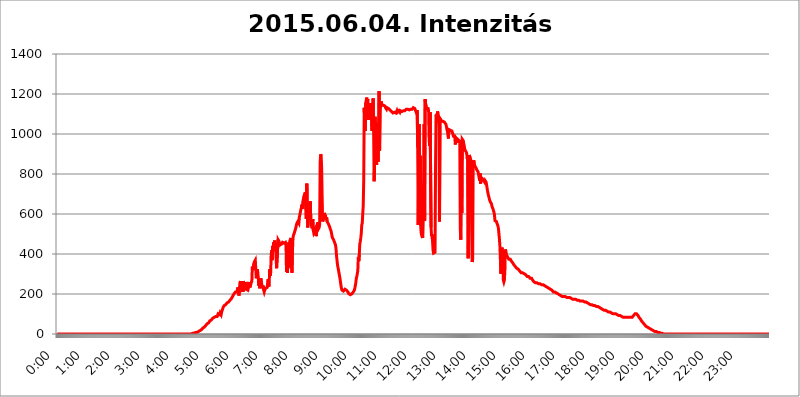
| Category | 2015.06.04. Intenzitás [W/m^2] |
|---|---|
| 0.0 | 0 |
| 0.0006944444444444445 | 0 |
| 0.001388888888888889 | 0 |
| 0.0020833333333333333 | 0 |
| 0.002777777777777778 | 0 |
| 0.003472222222222222 | 0 |
| 0.004166666666666667 | 0 |
| 0.004861111111111111 | 0 |
| 0.005555555555555556 | 0 |
| 0.0062499999999999995 | 0 |
| 0.006944444444444444 | 0 |
| 0.007638888888888889 | 0 |
| 0.008333333333333333 | 0 |
| 0.009027777777777779 | 0 |
| 0.009722222222222222 | 0 |
| 0.010416666666666666 | 0 |
| 0.011111111111111112 | 0 |
| 0.011805555555555555 | 0 |
| 0.012499999999999999 | 0 |
| 0.013194444444444444 | 0 |
| 0.013888888888888888 | 0 |
| 0.014583333333333332 | 0 |
| 0.015277777777777777 | 0 |
| 0.015972222222222224 | 0 |
| 0.016666666666666666 | 0 |
| 0.017361111111111112 | 0 |
| 0.018055555555555557 | 0 |
| 0.01875 | 0 |
| 0.019444444444444445 | 0 |
| 0.02013888888888889 | 0 |
| 0.020833333333333332 | 0 |
| 0.02152777777777778 | 0 |
| 0.022222222222222223 | 0 |
| 0.02291666666666667 | 0 |
| 0.02361111111111111 | 0 |
| 0.024305555555555556 | 0 |
| 0.024999999999999998 | 0 |
| 0.025694444444444447 | 0 |
| 0.02638888888888889 | 0 |
| 0.027083333333333334 | 0 |
| 0.027777777777777776 | 0 |
| 0.02847222222222222 | 0 |
| 0.029166666666666664 | 0 |
| 0.029861111111111113 | 0 |
| 0.030555555555555555 | 0 |
| 0.03125 | 0 |
| 0.03194444444444445 | 0 |
| 0.03263888888888889 | 0 |
| 0.03333333333333333 | 0 |
| 0.034027777777777775 | 0 |
| 0.034722222222222224 | 0 |
| 0.035416666666666666 | 0 |
| 0.036111111111111115 | 0 |
| 0.03680555555555556 | 0 |
| 0.0375 | 0 |
| 0.03819444444444444 | 0 |
| 0.03888888888888889 | 0 |
| 0.03958333333333333 | 0 |
| 0.04027777777777778 | 0 |
| 0.04097222222222222 | 0 |
| 0.041666666666666664 | 0 |
| 0.042361111111111106 | 0 |
| 0.04305555555555556 | 0 |
| 0.043750000000000004 | 0 |
| 0.044444444444444446 | 0 |
| 0.04513888888888889 | 0 |
| 0.04583333333333334 | 0 |
| 0.04652777777777778 | 0 |
| 0.04722222222222222 | 0 |
| 0.04791666666666666 | 0 |
| 0.04861111111111111 | 0 |
| 0.049305555555555554 | 0 |
| 0.049999999999999996 | 0 |
| 0.05069444444444445 | 0 |
| 0.051388888888888894 | 0 |
| 0.052083333333333336 | 0 |
| 0.05277777777777778 | 0 |
| 0.05347222222222222 | 0 |
| 0.05416666666666667 | 0 |
| 0.05486111111111111 | 0 |
| 0.05555555555555555 | 0 |
| 0.05625 | 0 |
| 0.05694444444444444 | 0 |
| 0.057638888888888885 | 0 |
| 0.05833333333333333 | 0 |
| 0.05902777777777778 | 0 |
| 0.059722222222222225 | 0 |
| 0.06041666666666667 | 0 |
| 0.061111111111111116 | 0 |
| 0.06180555555555556 | 0 |
| 0.0625 | 0 |
| 0.06319444444444444 | 0 |
| 0.06388888888888888 | 0 |
| 0.06458333333333334 | 0 |
| 0.06527777777777778 | 0 |
| 0.06597222222222222 | 0 |
| 0.06666666666666667 | 0 |
| 0.06736111111111111 | 0 |
| 0.06805555555555555 | 0 |
| 0.06874999999999999 | 0 |
| 0.06944444444444443 | 0 |
| 0.07013888888888889 | 0 |
| 0.07083333333333333 | 0 |
| 0.07152777777777779 | 0 |
| 0.07222222222222223 | 0 |
| 0.07291666666666667 | 0 |
| 0.07361111111111111 | 0 |
| 0.07430555555555556 | 0 |
| 0.075 | 0 |
| 0.07569444444444444 | 0 |
| 0.0763888888888889 | 0 |
| 0.07708333333333334 | 0 |
| 0.07777777777777778 | 0 |
| 0.07847222222222222 | 0 |
| 0.07916666666666666 | 0 |
| 0.0798611111111111 | 0 |
| 0.08055555555555556 | 0 |
| 0.08125 | 0 |
| 0.08194444444444444 | 0 |
| 0.08263888888888889 | 0 |
| 0.08333333333333333 | 0 |
| 0.08402777777777777 | 0 |
| 0.08472222222222221 | 0 |
| 0.08541666666666665 | 0 |
| 0.08611111111111112 | 0 |
| 0.08680555555555557 | 0 |
| 0.08750000000000001 | 0 |
| 0.08819444444444445 | 0 |
| 0.08888888888888889 | 0 |
| 0.08958333333333333 | 0 |
| 0.09027777777777778 | 0 |
| 0.09097222222222222 | 0 |
| 0.09166666666666667 | 0 |
| 0.09236111111111112 | 0 |
| 0.09305555555555556 | 0 |
| 0.09375 | 0 |
| 0.09444444444444444 | 0 |
| 0.09513888888888888 | 0 |
| 0.09583333333333333 | 0 |
| 0.09652777777777777 | 0 |
| 0.09722222222222222 | 0 |
| 0.09791666666666667 | 0 |
| 0.09861111111111111 | 0 |
| 0.09930555555555555 | 0 |
| 0.09999999999999999 | 0 |
| 0.10069444444444443 | 0 |
| 0.1013888888888889 | 0 |
| 0.10208333333333335 | 0 |
| 0.10277777777777779 | 0 |
| 0.10347222222222223 | 0 |
| 0.10416666666666667 | 0 |
| 0.10486111111111111 | 0 |
| 0.10555555555555556 | 0 |
| 0.10625 | 0 |
| 0.10694444444444444 | 0 |
| 0.1076388888888889 | 0 |
| 0.10833333333333334 | 0 |
| 0.10902777777777778 | 0 |
| 0.10972222222222222 | 0 |
| 0.1111111111111111 | 0 |
| 0.11180555555555556 | 0 |
| 0.11180555555555556 | 0 |
| 0.1125 | 0 |
| 0.11319444444444444 | 0 |
| 0.11388888888888889 | 0 |
| 0.11458333333333333 | 0 |
| 0.11527777777777777 | 0 |
| 0.11597222222222221 | 0 |
| 0.11666666666666665 | 0 |
| 0.1173611111111111 | 0 |
| 0.11805555555555557 | 0 |
| 0.11944444444444445 | 0 |
| 0.12013888888888889 | 0 |
| 0.12083333333333333 | 0 |
| 0.12152777777777778 | 0 |
| 0.12222222222222223 | 0 |
| 0.12291666666666667 | 0 |
| 0.12291666666666667 | 0 |
| 0.12361111111111112 | 0 |
| 0.12430555555555556 | 0 |
| 0.125 | 0 |
| 0.12569444444444444 | 0 |
| 0.12638888888888888 | 0 |
| 0.12708333333333333 | 0 |
| 0.16875 | 0 |
| 0.12847222222222224 | 0 |
| 0.12916666666666668 | 0 |
| 0.12986111111111112 | 0 |
| 0.13055555555555556 | 0 |
| 0.13125 | 0 |
| 0.13194444444444445 | 0 |
| 0.1326388888888889 | 0 |
| 0.13333333333333333 | 0 |
| 0.13402777777777777 | 0 |
| 0.13402777777777777 | 0 |
| 0.13472222222222222 | 0 |
| 0.13541666666666666 | 0 |
| 0.1361111111111111 | 0 |
| 0.13749999999999998 | 0 |
| 0.13819444444444443 | 0 |
| 0.1388888888888889 | 0 |
| 0.13958333333333334 | 0 |
| 0.14027777777777778 | 0 |
| 0.14097222222222222 | 0 |
| 0.14166666666666666 | 0 |
| 0.1423611111111111 | 0 |
| 0.14305555555555557 | 0 |
| 0.14375000000000002 | 0 |
| 0.14444444444444446 | 0 |
| 0.1451388888888889 | 0 |
| 0.1451388888888889 | 0 |
| 0.14652777777777778 | 0 |
| 0.14722222222222223 | 0 |
| 0.14791666666666667 | 0 |
| 0.1486111111111111 | 0 |
| 0.14930555555555555 | 0 |
| 0.15 | 0 |
| 0.15069444444444444 | 0 |
| 0.15138888888888888 | 0 |
| 0.15208333333333332 | 0 |
| 0.15277777777777776 | 0 |
| 0.15347222222222223 | 0 |
| 0.15416666666666667 | 0 |
| 0.15486111111111112 | 0 |
| 0.15555555555555556 | 0 |
| 0.15625 | 0 |
| 0.15694444444444444 | 0 |
| 0.15763888888888888 | 0 |
| 0.15833333333333333 | 0 |
| 0.15902777777777777 | 0 |
| 0.15972222222222224 | 0 |
| 0.16041666666666668 | 0 |
| 0.16111111111111112 | 0 |
| 0.16180555555555556 | 0 |
| 0.1625 | 0 |
| 0.16319444444444445 | 0 |
| 0.1638888888888889 | 0 |
| 0.16458333333333333 | 0 |
| 0.16527777777777777 | 0 |
| 0.16597222222222222 | 0 |
| 0.16666666666666666 | 0 |
| 0.1673611111111111 | 0 |
| 0.16805555555555554 | 0 |
| 0.16874999999999998 | 0 |
| 0.16944444444444443 | 0 |
| 0.17013888888888887 | 0 |
| 0.1708333333333333 | 0 |
| 0.17152777777777775 | 0 |
| 0.17222222222222225 | 0 |
| 0.1729166666666667 | 0 |
| 0.17361111111111113 | 0 |
| 0.17430555555555557 | 0 |
| 0.17500000000000002 | 0 |
| 0.17569444444444446 | 0 |
| 0.1763888888888889 | 0 |
| 0.17708333333333334 | 0 |
| 0.17777777777777778 | 0 |
| 0.17847222222222223 | 0 |
| 0.17916666666666667 | 0 |
| 0.1798611111111111 | 0 |
| 0.18055555555555555 | 0 |
| 0.18125 | 0 |
| 0.18194444444444444 | 0 |
| 0.1826388888888889 | 0 |
| 0.18333333333333335 | 0 |
| 0.1840277777777778 | 0 |
| 0.18472222222222223 | 0 |
| 0.18541666666666667 | 0 |
| 0.18611111111111112 | 0 |
| 0.18680555555555556 | 0 |
| 0.1875 | 0 |
| 0.18819444444444444 | 0 |
| 0.18888888888888888 | 3.525 |
| 0.18958333333333333 | 3.525 |
| 0.19027777777777777 | 3.525 |
| 0.1909722222222222 | 3.525 |
| 0.19166666666666665 | 3.525 |
| 0.19236111111111112 | 3.525 |
| 0.19305555555555554 | 3.525 |
| 0.19375 | 7.887 |
| 0.19444444444444445 | 7.887 |
| 0.1951388888888889 | 7.887 |
| 0.19583333333333333 | 7.887 |
| 0.19652777777777777 | 12.257 |
| 0.19722222222222222 | 12.257 |
| 0.19791666666666666 | 12.257 |
| 0.1986111111111111 | 12.257 |
| 0.19930555555555554 | 16.636 |
| 0.19999999999999998 | 16.636 |
| 0.20069444444444443 | 16.636 |
| 0.20138888888888887 | 21.024 |
| 0.2020833333333333 | 21.024 |
| 0.2027777777777778 | 21.024 |
| 0.2034722222222222 | 25.419 |
| 0.2041666666666667 | 29.823 |
| 0.20486111111111113 | 29.823 |
| 0.20555555555555557 | 34.234 |
| 0.20625000000000002 | 34.234 |
| 0.20694444444444446 | 38.653 |
| 0.2076388888888889 | 38.653 |
| 0.20833333333333334 | 43.079 |
| 0.20902777777777778 | 47.511 |
| 0.20972222222222223 | 47.511 |
| 0.21041666666666667 | 51.951 |
| 0.2111111111111111 | 51.951 |
| 0.21180555555555555 | 56.398 |
| 0.2125 | 56.398 |
| 0.21319444444444444 | 60.85 |
| 0.2138888888888889 | 65.31 |
| 0.21458333333333335 | 65.31 |
| 0.2152777777777778 | 69.775 |
| 0.21597222222222223 | 69.775 |
| 0.21666666666666667 | 74.246 |
| 0.21736111111111112 | 74.246 |
| 0.21805555555555556 | 78.722 |
| 0.21875 | 78.722 |
| 0.21944444444444444 | 83.205 |
| 0.22013888888888888 | 83.205 |
| 0.22083333333333333 | 83.205 |
| 0.22152777777777777 | 83.205 |
| 0.2222222222222222 | 87.692 |
| 0.22291666666666665 | 92.184 |
| 0.2236111111111111 | 87.692 |
| 0.22430555555555556 | 87.692 |
| 0.225 | 87.692 |
| 0.22569444444444445 | 101.184 |
| 0.2263888888888889 | 105.69 |
| 0.22708333333333333 | 101.184 |
| 0.22777777777777777 | 96.682 |
| 0.22847222222222222 | 105.69 |
| 0.22916666666666666 | 101.184 |
| 0.2298611111111111 | 96.682 |
| 0.23055555555555554 | 110.201 |
| 0.23124999999999998 | 105.69 |
| 0.23194444444444443 | 110.201 |
| 0.23263888888888887 | 132.814 |
| 0.2333333333333333 | 137.347 |
| 0.2340277777777778 | 141.884 |
| 0.2347222222222222 | 141.884 |
| 0.2354166666666667 | 146.423 |
| 0.23611111111111113 | 146.423 |
| 0.23680555555555557 | 150.964 |
| 0.23750000000000002 | 150.964 |
| 0.23819444444444446 | 155.509 |
| 0.2388888888888889 | 155.509 |
| 0.23958333333333334 | 160.056 |
| 0.24027777777777778 | 160.056 |
| 0.24097222222222223 | 164.605 |
| 0.24166666666666667 | 164.605 |
| 0.2423611111111111 | 169.156 |
| 0.24305555555555555 | 169.156 |
| 0.24375 | 173.709 |
| 0.24444444444444446 | 178.264 |
| 0.24513888888888888 | 182.82 |
| 0.24583333333333335 | 187.378 |
| 0.2465277777777778 | 191.937 |
| 0.24722222222222223 | 191.937 |
| 0.24791666666666667 | 201.058 |
| 0.24861111111111112 | 201.058 |
| 0.24930555555555556 | 205.62 |
| 0.25 | 210.182 |
| 0.25069444444444444 | 210.182 |
| 0.2513888888888889 | 210.182 |
| 0.2520833333333333 | 210.182 |
| 0.25277777777777777 | 223.873 |
| 0.2534722222222222 | 233 |
| 0.25416666666666665 | 210.182 |
| 0.2548611111111111 | 191.937 |
| 0.2555555555555556 | 228.436 |
| 0.25625000000000003 | 255.813 |
| 0.2569444444444445 | 264.932 |
| 0.2576388888888889 | 233 |
| 0.25833333333333336 | 255.813 |
| 0.2590277777777778 | 251.251 |
| 0.25972222222222224 | 260.373 |
| 0.2604166666666667 | 210.182 |
| 0.2611111111111111 | 264.932 |
| 0.26180555555555557 | 269.49 |
| 0.2625 | 228.436 |
| 0.26319444444444445 | 251.251 |
| 0.2638888888888889 | 219.309 |
| 0.26458333333333334 | 260.373 |
| 0.2652777777777778 | 223.873 |
| 0.2659722222222222 | 228.436 |
| 0.26666666666666666 | 219.309 |
| 0.2673611111111111 | 219.309 |
| 0.26805555555555555 | 219.309 |
| 0.26875 | 242.127 |
| 0.26944444444444443 | 260.373 |
| 0.2701388888888889 | 233 |
| 0.2708333333333333 | 228.436 |
| 0.27152777777777776 | 251.251 |
| 0.2722222222222222 | 255.813 |
| 0.27291666666666664 | 264.932 |
| 0.2736111111111111 | 337.639 |
| 0.2743055555555555 | 328.584 |
| 0.27499999999999997 | 319.517 |
| 0.27569444444444446 | 351.198 |
| 0.27638888888888885 | 360.221 |
| 0.27708333333333335 | 364.728 |
| 0.2777777777777778 | 369.23 |
| 0.27847222222222223 | 369.23 |
| 0.2791666666666667 | 278.603 |
| 0.2798611111111111 | 278.603 |
| 0.28055555555555556 | 324.052 |
| 0.28125 | 305.898 |
| 0.28194444444444444 | 283.156 |
| 0.2826388888888889 | 242.127 |
| 0.2833333333333333 | 278.603 |
| 0.28402777777777777 | 228.436 |
| 0.2847222222222222 | 228.436 |
| 0.28541666666666665 | 278.603 |
| 0.28611111111111115 | 283.156 |
| 0.28680555555555554 | 246.689 |
| 0.28750000000000003 | 228.436 |
| 0.2881944444444445 | 223.873 |
| 0.2888888888888889 | 242.127 |
| 0.28958333333333336 | 219.309 |
| 0.2902777777777778 | 210.182 |
| 0.29097222222222224 | 219.309 |
| 0.2916666666666667 | 219.309 |
| 0.2923611111111111 | 228.436 |
| 0.29305555555555557 | 233 |
| 0.29375 | 233 |
| 0.29444444444444445 | 233 |
| 0.2951388888888889 | 255.813 |
| 0.29583333333333334 | 274.047 |
| 0.2965277777777778 | 237.564 |
| 0.2972222222222222 | 246.689 |
| 0.29791666666666666 | 324.052 |
| 0.2986111111111111 | 292.259 |
| 0.29930555555555555 | 305.898 |
| 0.3 | 391.685 |
| 0.30069444444444443 | 418.492 |
| 0.3013888888888889 | 369.23 |
| 0.3020833333333333 | 440.702 |
| 0.30277777777777776 | 414.035 |
| 0.3034722222222222 | 458.38 |
| 0.30416666666666664 | 440.702 |
| 0.3048611111111111 | 467.187 |
| 0.3055555555555555 | 471.582 |
| 0.30624999999999997 | 436.27 |
| 0.3069444444444444 | 440.702 |
| 0.3076388888888889 | 328.584 |
| 0.30833333333333335 | 333.113 |
| 0.3090277777777778 | 324.052 |
| 0.30972222222222223 | 471.582 |
| 0.3104166666666667 | 471.582 |
| 0.3111111111111111 | 462.786 |
| 0.31180555555555556 | 458.38 |
| 0.3125 | 445.129 |
| 0.31319444444444444 | 449.551 |
| 0.3138888888888889 | 445.129 |
| 0.3145833333333333 | 449.551 |
| 0.31527777777777777 | 453.968 |
| 0.3159722222222222 | 458.38 |
| 0.31666666666666665 | 458.38 |
| 0.31736111111111115 | 458.38 |
| 0.31805555555555554 | 453.968 |
| 0.31875000000000003 | 453.968 |
| 0.3194444444444445 | 453.968 |
| 0.3201388888888889 | 458.38 |
| 0.32083333333333336 | 449.551 |
| 0.3215277777777778 | 310.44 |
| 0.32222222222222224 | 436.27 |
| 0.3229166666666667 | 305.898 |
| 0.3236111111111111 | 305.898 |
| 0.32430555555555557 | 440.702 |
| 0.325 | 458.38 |
| 0.32569444444444445 | 333.113 |
| 0.3263888888888889 | 467.187 |
| 0.32708333333333334 | 471.582 |
| 0.3277777777777778 | 480.356 |
| 0.3284722222222222 | 400.638 |
| 0.32916666666666666 | 305.898 |
| 0.3298611111111111 | 409.574 |
| 0.33055555555555555 | 475.972 |
| 0.33125 | 493.475 |
| 0.33194444444444443 | 497.836 |
| 0.3326388888888889 | 506.542 |
| 0.3333333333333333 | 515.223 |
| 0.3340277777777778 | 523.88 |
| 0.3347222222222222 | 532.513 |
| 0.3354166666666667 | 545.416 |
| 0.3361111111111111 | 553.986 |
| 0.3368055555555556 | 558.261 |
| 0.33749999999999997 | 562.53 |
| 0.33819444444444446 | 566.793 |
| 0.33888888888888885 | 553.986 |
| 0.33958333333333335 | 583.779 |
| 0.34027777777777773 | 596.45 |
| 0.34097222222222223 | 609.062 |
| 0.3416666666666666 | 621.613 |
| 0.3423611111111111 | 629.948 |
| 0.3430555555555555 | 646.537 |
| 0.34375 | 625.784 |
| 0.3444444444444445 | 625.784 |
| 0.3451388888888889 | 671.22 |
| 0.3458333333333334 | 687.544 |
| 0.34652777777777777 | 687.544 |
| 0.34722222222222227 | 687.544 |
| 0.34791666666666665 | 707.8 |
| 0.34861111111111115 | 625.784 |
| 0.34930555555555554 | 575.299 |
| 0.35000000000000003 | 751.803 |
| 0.3506944444444444 | 613.252 |
| 0.3513888888888889 | 532.513 |
| 0.3520833333333333 | 583.779 |
| 0.3527777777777778 | 596.45 |
| 0.3534722222222222 | 579.542 |
| 0.3541666666666667 | 583.779 |
| 0.3548611111111111 | 663.019 |
| 0.35555555555555557 | 575.299 |
| 0.35625 | 553.986 |
| 0.35694444444444445 | 536.82 |
| 0.3576388888888889 | 528.2 |
| 0.35833333333333334 | 575.299 |
| 0.3590277777777778 | 519.555 |
| 0.3597222222222222 | 506.542 |
| 0.36041666666666666 | 502.192 |
| 0.3611111111111111 | 506.542 |
| 0.36180555555555555 | 523.88 |
| 0.3625 | 506.542 |
| 0.36319444444444443 | 489.108 |
| 0.3638888888888889 | 489.108 |
| 0.3645833333333333 | 536.82 |
| 0.3652777777777778 | 558.261 |
| 0.3659722222222222 | 523.88 |
| 0.3666666666666667 | 523.88 |
| 0.3673611111111111 | 532.513 |
| 0.3680555555555556 | 549.704 |
| 0.36874999999999997 | 860.676 |
| 0.36944444444444446 | 898.668 |
| 0.37013888888888885 | 891.099 |
| 0.37083333333333335 | 829.981 |
| 0.37152777777777773 | 687.544 |
| 0.37222222222222223 | 562.53 |
| 0.3729166666666666 | 558.261 |
| 0.3736111111111111 | 579.542 |
| 0.3743055555555555 | 604.864 |
| 0.375 | 604.864 |
| 0.3756944444444445 | 600.661 |
| 0.3763888888888889 | 588.009 |
| 0.3770833333333334 | 571.049 |
| 0.37777777777777777 | 583.779 |
| 0.37847222222222227 | 562.53 |
| 0.37916666666666665 | 558.261 |
| 0.37986111111111115 | 553.986 |
| 0.38055555555555554 | 558.261 |
| 0.38125000000000003 | 549.704 |
| 0.3819444444444444 | 536.82 |
| 0.3826388888888889 | 528.2 |
| 0.3833333333333333 | 523.88 |
| 0.3840277777777778 | 515.223 |
| 0.3847222222222222 | 502.192 |
| 0.3854166666666667 | 489.108 |
| 0.3861111111111111 | 480.356 |
| 0.38680555555555557 | 475.972 |
| 0.3875 | 471.582 |
| 0.38819444444444445 | 467.187 |
| 0.3888888888888889 | 458.38 |
| 0.38958333333333334 | 453.968 |
| 0.3902777777777778 | 445.129 |
| 0.3909722222222222 | 427.39 |
| 0.39166666666666666 | 391.685 |
| 0.3923611111111111 | 369.23 |
| 0.39305555555555555 | 346.682 |
| 0.39375 | 333.113 |
| 0.39444444444444443 | 319.517 |
| 0.3951388888888889 | 305.898 |
| 0.3958333333333333 | 292.259 |
| 0.3965277777777778 | 278.603 |
| 0.3972222222222222 | 260.373 |
| 0.3979166666666667 | 242.127 |
| 0.3986111111111111 | 228.436 |
| 0.3993055555555556 | 219.309 |
| 0.39999999999999997 | 214.746 |
| 0.40069444444444446 | 214.746 |
| 0.40138888888888885 | 214.746 |
| 0.40208333333333335 | 214.746 |
| 0.40277777777777773 | 219.309 |
| 0.40347222222222223 | 223.873 |
| 0.4041666666666666 | 223.873 |
| 0.4048611111111111 | 223.873 |
| 0.4055555555555555 | 219.309 |
| 0.40625 | 219.309 |
| 0.4069444444444445 | 214.746 |
| 0.4076388888888889 | 210.182 |
| 0.4083333333333334 | 205.62 |
| 0.40902777777777777 | 201.058 |
| 0.40972222222222227 | 196.497 |
| 0.41041666666666665 | 196.497 |
| 0.41111111111111115 | 196.497 |
| 0.41180555555555554 | 196.497 |
| 0.41250000000000003 | 196.497 |
| 0.4131944444444444 | 201.058 |
| 0.4138888888888889 | 201.058 |
| 0.4145833333333333 | 205.62 |
| 0.4152777777777778 | 210.182 |
| 0.4159722222222222 | 214.746 |
| 0.4166666666666667 | 219.309 |
| 0.4173611111111111 | 228.436 |
| 0.41805555555555557 | 242.127 |
| 0.41875 | 255.813 |
| 0.41944444444444445 | 278.603 |
| 0.4201388888888889 | 287.709 |
| 0.42083333333333334 | 301.354 |
| 0.4215277777777778 | 314.98 |
| 0.4222222222222222 | 382.715 |
| 0.42291666666666666 | 364.728 |
| 0.4236111111111111 | 396.164 |
| 0.42430555555555555 | 449.551 |
| 0.425 | 462.786 |
| 0.42569444444444443 | 480.356 |
| 0.4263888888888889 | 502.192 |
| 0.4270833333333333 | 545.416 |
| 0.4277777777777778 | 553.986 |
| 0.4284722222222222 | 600.661 |
| 0.4291666666666667 | 642.4 |
| 0.4298611111111111 | 771.559 |
| 0.4305555555555556 | 1131.708 |
| 0.43124999999999997 | 1048.508 |
| 0.43194444444444446 | 1014.852 |
| 0.43263888888888885 | 1154.814 |
| 0.43333333333333335 | 1154.814 |
| 0.43402777777777773 | 1182.099 |
| 0.43472222222222223 | 1150.946 |
| 0.4354166666666666 | 1174.263 |
| 0.4361111111111111 | 1071.027 |
| 0.4368055555555555 | 1074.789 |
| 0.4375 | 1116.426 |
| 0.4381944444444445 | 1147.086 |
| 0.4388888888888889 | 1108.816 |
| 0.4395833333333334 | 1154.814 |
| 0.44027777777777777 | 1154.814 |
| 0.44097222222222227 | 1158.689 |
| 0.44166666666666665 | 1014.852 |
| 0.44236111111111115 | 1101.226 |
| 0.44305555555555554 | 1178.177 |
| 0.44375000000000003 | 1011.118 |
| 0.4444444444444444 | 763.674 |
| 0.4451388888888889 | 856.855 |
| 0.4458333333333333 | 1086.097 |
| 0.4465277777777778 | 984.98 |
| 0.4472222222222222 | 917.534 |
| 0.4479166666666667 | 845.365 |
| 0.4486111111111111 | 1056.004 |
| 0.44930555555555557 | 1011.118 |
| 0.45 | 860.676 |
| 0.45069444444444445 | 1041.019 |
| 0.4513888888888889 | 1213.804 |
| 0.45208333333333334 | 917.534 |
| 0.4527777777777778 | 1124.056 |
| 0.4534722222222222 | 1131.708 |
| 0.45416666666666666 | 1162.571 |
| 0.4548611111111111 | 1158.689 |
| 0.45555555555555555 | 1143.232 |
| 0.45625 | 1147.086 |
| 0.45694444444444443 | 1147.086 |
| 0.4576388888888889 | 1143.232 |
| 0.4583333333333333 | 1143.232 |
| 0.4590277777777778 | 1139.384 |
| 0.4597222222222222 | 1139.384 |
| 0.4604166666666667 | 1131.708 |
| 0.4611111111111111 | 1127.879 |
| 0.4618055555555556 | 1124.056 |
| 0.46249999999999997 | 1131.708 |
| 0.46319444444444446 | 1127.879 |
| 0.46388888888888885 | 1127.879 |
| 0.46458333333333335 | 1127.879 |
| 0.46527777777777773 | 1127.879 |
| 0.46597222222222223 | 1124.056 |
| 0.4666666666666666 | 1120.238 |
| 0.4673611111111111 | 1116.426 |
| 0.4680555555555555 | 1116.426 |
| 0.46875 | 1112.618 |
| 0.4694444444444445 | 1116.426 |
| 0.4701388888888889 | 1108.816 |
| 0.4708333333333334 | 1105.019 |
| 0.47152777777777777 | 1108.816 |
| 0.47222222222222227 | 1108.816 |
| 0.47291666666666665 | 1108.816 |
| 0.47361111111111115 | 1105.019 |
| 0.47430555555555554 | 1108.816 |
| 0.47500000000000003 | 1105.019 |
| 0.4756944444444444 | 1108.816 |
| 0.4763888888888889 | 1116.426 |
| 0.4770833333333333 | 1108.816 |
| 0.4777777777777778 | 1105.019 |
| 0.4784722222222222 | 1108.816 |
| 0.4791666666666667 | 1116.426 |
| 0.4798611111111111 | 1116.426 |
| 0.48055555555555557 | 1108.816 |
| 0.48125 | 1116.426 |
| 0.48194444444444445 | 1112.618 |
| 0.4826388888888889 | 1112.618 |
| 0.48333333333333334 | 1112.618 |
| 0.4840277777777778 | 1112.618 |
| 0.4847222222222222 | 1116.426 |
| 0.48541666666666666 | 1116.426 |
| 0.4861111111111111 | 1116.426 |
| 0.48680555555555555 | 1116.426 |
| 0.4875 | 1116.426 |
| 0.48819444444444443 | 1116.426 |
| 0.4888888888888889 | 1116.426 |
| 0.4895833333333333 | 1124.056 |
| 0.4902777777777778 | 1124.056 |
| 0.4909722222222222 | 1124.056 |
| 0.4916666666666667 | 1124.056 |
| 0.4923611111111111 | 1124.056 |
| 0.4930555555555556 | 1127.879 |
| 0.49374999999999997 | 1120.238 |
| 0.49444444444444446 | 1124.056 |
| 0.49513888888888885 | 1124.056 |
| 0.49583333333333335 | 1124.056 |
| 0.49652777777777773 | 1120.238 |
| 0.49722222222222223 | 1124.056 |
| 0.4979166666666666 | 1124.056 |
| 0.4986111111111111 | 1127.879 |
| 0.4993055555555555 | 1131.708 |
| 0.5 | 1127.879 |
| 0.5006944444444444 | 1127.879 |
| 0.5013888888888889 | 1127.879 |
| 0.5020833333333333 | 1127.879 |
| 0.5027777777777778 | 1131.708 |
| 0.5034722222222222 | 1108.816 |
| 0.5041666666666667 | 1112.618 |
| 0.5048611111111111 | 1120.238 |
| 0.5055555555555555 | 932.576 |
| 0.50625 | 545.416 |
| 0.5069444444444444 | 822.26 |
| 0.5076388888888889 | 1048.508 |
| 0.5083333333333333 | 617.436 |
| 0.5090277777777777 | 891.099 |
| 0.5097222222222222 | 541.121 |
| 0.5104166666666666 | 506.542 |
| 0.5111111111111112 | 493.475 |
| 0.5118055555555555 | 489.108 |
| 0.5125000000000001 | 480.356 |
| 0.5131944444444444 | 634.105 |
| 0.513888888888889 | 783.342 |
| 0.5145833333333333 | 1048.508 |
| 0.5152777777777778 | 566.793 |
| 0.5159722222222222 | 1174.263 |
| 0.5166666666666667 | 1150.946 |
| 0.517361111111111 | 1143.232 |
| 0.5180555555555556 | 1127.879 |
| 0.5187499999999999 | 1124.056 |
| 0.5194444444444445 | 1131.708 |
| 0.5201388888888888 | 1127.879 |
| 0.5208333333333334 | 1116.426 |
| 0.5215277777777778 | 984.98 |
| 0.5222222222222223 | 940.082 |
| 0.5229166666666667 | 1108.816 |
| 0.5236111111111111 | 1105.019 |
| 0.5243055555555556 | 532.513 |
| 0.525 | 489.108 |
| 0.5256944444444445 | 497.836 |
| 0.5263888888888889 | 462.786 |
| 0.5270833333333333 | 418.492 |
| 0.5277777777777778 | 405.108 |
| 0.5284722222222222 | 400.638 |
| 0.5291666666666667 | 400.638 |
| 0.5298611111111111 | 409.574 |
| 0.5305555555555556 | 829.981 |
| 0.53125 | 1097.437 |
| 0.5319444444444444 | 1101.226 |
| 0.5326388888888889 | 1082.324 |
| 0.5333333333333333 | 1112.618 |
| 0.5340277777777778 | 1101.226 |
| 0.5347222222222222 | 1105.019 |
| 0.5354166666666667 | 1033.537 |
| 0.5361111111111111 | 562.53 |
| 0.5368055555555555 | 1078.555 |
| 0.5375 | 1078.555 |
| 0.5381944444444444 | 1071.027 |
| 0.5388888888888889 | 1063.51 |
| 0.5395833333333333 | 1059.756 |
| 0.5402777777777777 | 1059.756 |
| 0.5409722222222222 | 1063.51 |
| 0.5416666666666666 | 1059.756 |
| 0.5423611111111112 | 1059.756 |
| 0.5430555555555555 | 1059.756 |
| 0.5437500000000001 | 1059.756 |
| 0.5444444444444444 | 1056.004 |
| 0.545138888888889 | 1048.508 |
| 0.5458333333333333 | 1037.277 |
| 0.5465277777777778 | 1022.323 |
| 0.5472222222222222 | 1014.852 |
| 0.5479166666666667 | 1018.587 |
| 0.548611111111111 | 977.508 |
| 0.5493055555555556 | 1022.323 |
| 0.5499999999999999 | 1018.587 |
| 0.5506944444444445 | 1022.323 |
| 0.5513888888888888 | 1018.587 |
| 0.5520833333333334 | 1018.587 |
| 0.5527777777777778 | 1022.323 |
| 0.5534722222222223 | 1014.852 |
| 0.5541666666666667 | 1007.383 |
| 0.5548611111111111 | 999.916 |
| 0.5555555555555556 | 988.714 |
| 0.55625 | 984.98 |
| 0.5569444444444445 | 984.98 |
| 0.5576388888888889 | 984.98 |
| 0.5583333333333333 | 947.58 |
| 0.5590277777777778 | 981.244 |
| 0.5597222222222222 | 977.508 |
| 0.5604166666666667 | 973.772 |
| 0.5611111111111111 | 962.555 |
| 0.5618055555555556 | 955.071 |
| 0.5625 | 970.034 |
| 0.5631944444444444 | 970.034 |
| 0.5638888888888889 | 973.772 |
| 0.5645833333333333 | 962.555 |
| 0.5652777777777778 | 523.88 |
| 0.5659722222222222 | 471.582 |
| 0.5666666666666667 | 970.034 |
| 0.5673611111111111 | 604.864 |
| 0.5680555555555555 | 973.772 |
| 0.56875 | 970.034 |
| 0.5694444444444444 | 966.295 |
| 0.5701388888888889 | 951.327 |
| 0.5708333333333333 | 940.082 |
| 0.5715277777777777 | 925.06 |
| 0.5722222222222222 | 917.534 |
| 0.5729166666666666 | 913.766 |
| 0.5736111111111112 | 909.996 |
| 0.5743055555555555 | 902.447 |
| 0.5750000000000001 | 875.918 |
| 0.5756944444444444 | 883.516 |
| 0.576388888888889 | 378.224 |
| 0.5770833333333333 | 378.224 |
| 0.5777777777777778 | 894.885 |
| 0.5784722222222222 | 891.099 |
| 0.5791666666666667 | 879.719 |
| 0.579861111111111 | 875.918 |
| 0.5805555555555556 | 864.493 |
| 0.5812499999999999 | 510.885 |
| 0.5819444444444445 | 360.221 |
| 0.5826388888888888 | 373.729 |
| 0.5833333333333334 | 856.855 |
| 0.5840277777777778 | 868.305 |
| 0.5847222222222223 | 856.855 |
| 0.5854166666666667 | 845.365 |
| 0.5861111111111111 | 837.682 |
| 0.5868055555555556 | 837.682 |
| 0.5875 | 829.981 |
| 0.5881944444444445 | 822.26 |
| 0.5888888888888889 | 818.392 |
| 0.5895833333333333 | 822.26 |
| 0.5902777777777778 | 810.641 |
| 0.5909722222222222 | 810.641 |
| 0.5916666666666667 | 806.757 |
| 0.5923611111111111 | 767.62 |
| 0.5930555555555556 | 802.868 |
| 0.59375 | 751.803 |
| 0.5944444444444444 | 783.342 |
| 0.5951388888888889 | 783.342 |
| 0.5958333333333333 | 783.342 |
| 0.5965277777777778 | 775.492 |
| 0.5972222222222222 | 771.559 |
| 0.5979166666666667 | 767.62 |
| 0.5986111111111111 | 767.62 |
| 0.5993055555555555 | 759.723 |
| 0.6 | 767.62 |
| 0.6006944444444444 | 763.674 |
| 0.6013888888888889 | 759.723 |
| 0.6020833333333333 | 747.834 |
| 0.6027777777777777 | 731.896 |
| 0.6034722222222222 | 715.858 |
| 0.6041666666666666 | 703.762 |
| 0.6048611111111112 | 691.608 |
| 0.6055555555555555 | 683.473 |
| 0.6062500000000001 | 671.22 |
| 0.6069444444444444 | 667.123 |
| 0.607638888888889 | 658.909 |
| 0.6083333333333333 | 654.791 |
| 0.6090277777777778 | 650.667 |
| 0.6097222222222222 | 638.256 |
| 0.6104166666666667 | 638.256 |
| 0.611111111111111 | 625.784 |
| 0.6118055555555556 | 617.436 |
| 0.6124999999999999 | 609.062 |
| 0.6131944444444445 | 596.45 |
| 0.6138888888888888 | 566.793 |
| 0.6145833333333334 | 562.53 |
| 0.6152777777777778 | 562.53 |
| 0.6159722222222223 | 562.53 |
| 0.6166666666666667 | 553.986 |
| 0.6173611111111111 | 549.704 |
| 0.6180555555555556 | 541.121 |
| 0.61875 | 528.2 |
| 0.6194444444444445 | 502.192 |
| 0.6201388888888889 | 475.972 |
| 0.6208333333333333 | 440.702 |
| 0.6215277777777778 | 440.702 |
| 0.6222222222222222 | 301.354 |
| 0.6229166666666667 | 409.574 |
| 0.6236111111111111 | 431.833 |
| 0.6243055555555556 | 422.943 |
| 0.625 | 418.492 |
| 0.6256944444444444 | 269.49 |
| 0.6263888888888889 | 260.373 |
| 0.6270833333333333 | 269.49 |
| 0.6277777777777778 | 314.98 |
| 0.6284722222222222 | 422.943 |
| 0.6291666666666667 | 414.035 |
| 0.6298611111111111 | 400.638 |
| 0.6305555555555555 | 391.685 |
| 0.63125 | 391.685 |
| 0.6319444444444444 | 382.715 |
| 0.6326388888888889 | 378.224 |
| 0.6333333333333333 | 373.729 |
| 0.6340277777777777 | 378.224 |
| 0.6347222222222222 | 378.224 |
| 0.6354166666666666 | 373.729 |
| 0.6361111111111112 | 369.23 |
| 0.6368055555555555 | 364.728 |
| 0.6375000000000001 | 364.728 |
| 0.6381944444444444 | 360.221 |
| 0.638888888888889 | 355.712 |
| 0.6395833333333333 | 351.198 |
| 0.6402777777777778 | 346.682 |
| 0.6409722222222222 | 342.162 |
| 0.6416666666666667 | 342.162 |
| 0.642361111111111 | 337.639 |
| 0.6430555555555556 | 333.113 |
| 0.6437499999999999 | 333.113 |
| 0.6444444444444445 | 328.584 |
| 0.6451388888888888 | 328.584 |
| 0.6458333333333334 | 324.052 |
| 0.6465277777777778 | 324.052 |
| 0.6472222222222223 | 319.517 |
| 0.6479166666666667 | 319.517 |
| 0.6486111111111111 | 314.98 |
| 0.6493055555555556 | 310.44 |
| 0.65 | 310.44 |
| 0.6506944444444445 | 305.898 |
| 0.6513888888888889 | 305.898 |
| 0.6520833333333333 | 305.898 |
| 0.6527777777777778 | 305.898 |
| 0.6534722222222222 | 305.898 |
| 0.6541666666666667 | 301.354 |
| 0.6548611111111111 | 301.354 |
| 0.6555555555555556 | 296.808 |
| 0.65625 | 296.808 |
| 0.6569444444444444 | 296.808 |
| 0.6576388888888889 | 296.808 |
| 0.6583333333333333 | 292.259 |
| 0.6590277777777778 | 287.709 |
| 0.6597222222222222 | 287.709 |
| 0.6604166666666667 | 287.709 |
| 0.6611111111111111 | 287.709 |
| 0.6618055555555555 | 283.156 |
| 0.6625 | 283.156 |
| 0.6631944444444444 | 278.603 |
| 0.6638888888888889 | 278.603 |
| 0.6645833333333333 | 278.603 |
| 0.6652777777777777 | 278.603 |
| 0.6659722222222222 | 274.047 |
| 0.6666666666666666 | 269.49 |
| 0.6673611111111111 | 269.49 |
| 0.6680555555555556 | 264.932 |
| 0.6687500000000001 | 260.373 |
| 0.6694444444444444 | 260.373 |
| 0.6701388888888888 | 255.813 |
| 0.6708333333333334 | 255.813 |
| 0.6715277777777778 | 255.813 |
| 0.6722222222222222 | 255.813 |
| 0.6729166666666666 | 255.813 |
| 0.6736111111111112 | 255.813 |
| 0.6743055555555556 | 251.251 |
| 0.6749999999999999 | 251.251 |
| 0.6756944444444444 | 251.251 |
| 0.6763888888888889 | 251.251 |
| 0.6770833333333334 | 251.251 |
| 0.6777777777777777 | 251.251 |
| 0.6784722222222223 | 251.251 |
| 0.6791666666666667 | 246.689 |
| 0.6798611111111111 | 246.689 |
| 0.6805555555555555 | 246.689 |
| 0.68125 | 246.689 |
| 0.6819444444444445 | 242.127 |
| 0.6826388888888889 | 242.127 |
| 0.6833333333333332 | 242.127 |
| 0.6840277777777778 | 242.127 |
| 0.6847222222222222 | 237.564 |
| 0.6854166666666667 | 237.564 |
| 0.686111111111111 | 237.564 |
| 0.6868055555555556 | 233 |
| 0.6875 | 233 |
| 0.6881944444444444 | 228.436 |
| 0.688888888888889 | 228.436 |
| 0.6895833333333333 | 228.436 |
| 0.6902777777777778 | 223.873 |
| 0.6909722222222222 | 223.873 |
| 0.6916666666666668 | 223.873 |
| 0.6923611111111111 | 219.309 |
| 0.6930555555555555 | 219.309 |
| 0.69375 | 219.309 |
| 0.6944444444444445 | 214.746 |
| 0.6951388888888889 | 214.746 |
| 0.6958333333333333 | 210.182 |
| 0.6965277777777777 | 210.182 |
| 0.6972222222222223 | 210.182 |
| 0.6979166666666666 | 210.182 |
| 0.6986111111111111 | 210.182 |
| 0.6993055555555556 | 205.62 |
| 0.7000000000000001 | 205.62 |
| 0.7006944444444444 | 205.62 |
| 0.7013888888888888 | 201.058 |
| 0.7020833333333334 | 201.058 |
| 0.7027777777777778 | 201.058 |
| 0.7034722222222222 | 196.497 |
| 0.7041666666666666 | 196.497 |
| 0.7048611111111112 | 191.937 |
| 0.7055555555555556 | 191.937 |
| 0.7062499999999999 | 191.937 |
| 0.7069444444444444 | 191.937 |
| 0.7076388888888889 | 191.937 |
| 0.7083333333333334 | 187.378 |
| 0.7090277777777777 | 191.937 |
| 0.7097222222222223 | 187.378 |
| 0.7104166666666667 | 187.378 |
| 0.7111111111111111 | 187.378 |
| 0.7118055555555555 | 187.378 |
| 0.7125 | 187.378 |
| 0.7131944444444445 | 182.82 |
| 0.7138888888888889 | 182.82 |
| 0.7145833333333332 | 182.82 |
| 0.7152777777777778 | 182.82 |
| 0.7159722222222222 | 182.82 |
| 0.7166666666666667 | 182.82 |
| 0.717361111111111 | 182.82 |
| 0.7180555555555556 | 182.82 |
| 0.71875 | 182.82 |
| 0.7194444444444444 | 178.264 |
| 0.720138888888889 | 178.264 |
| 0.7208333333333333 | 178.264 |
| 0.7215277777777778 | 178.264 |
| 0.7222222222222222 | 173.709 |
| 0.7229166666666668 | 173.709 |
| 0.7236111111111111 | 173.709 |
| 0.7243055555555555 | 173.709 |
| 0.725 | 173.709 |
| 0.7256944444444445 | 173.709 |
| 0.7263888888888889 | 173.709 |
| 0.7270833333333333 | 173.709 |
| 0.7277777777777777 | 173.709 |
| 0.7284722222222223 | 169.156 |
| 0.7291666666666666 | 169.156 |
| 0.7298611111111111 | 169.156 |
| 0.7305555555555556 | 169.156 |
| 0.7312500000000001 | 169.156 |
| 0.7319444444444444 | 169.156 |
| 0.7326388888888888 | 169.156 |
| 0.7333333333333334 | 164.605 |
| 0.7340277777777778 | 164.605 |
| 0.7347222222222222 | 164.605 |
| 0.7354166666666666 | 164.605 |
| 0.7361111111111112 | 164.605 |
| 0.7368055555555556 | 164.605 |
| 0.7374999999999999 | 164.605 |
| 0.7381944444444444 | 160.056 |
| 0.7388888888888889 | 160.056 |
| 0.7395833333333334 | 160.056 |
| 0.7402777777777777 | 160.056 |
| 0.7409722222222223 | 160.056 |
| 0.7416666666666667 | 160.056 |
| 0.7423611111111111 | 155.509 |
| 0.7430555555555555 | 155.509 |
| 0.74375 | 155.509 |
| 0.7444444444444445 | 155.509 |
| 0.7451388888888889 | 155.509 |
| 0.7458333333333332 | 150.964 |
| 0.7465277777777778 | 150.964 |
| 0.7472222222222222 | 150.964 |
| 0.7479166666666667 | 146.423 |
| 0.748611111111111 | 146.423 |
| 0.7493055555555556 | 146.423 |
| 0.75 | 146.423 |
| 0.7506944444444444 | 146.423 |
| 0.751388888888889 | 141.884 |
| 0.7520833333333333 | 141.884 |
| 0.7527777777777778 | 146.423 |
| 0.7534722222222222 | 141.884 |
| 0.7541666666666668 | 141.884 |
| 0.7548611111111111 | 137.347 |
| 0.7555555555555555 | 137.347 |
| 0.75625 | 137.347 |
| 0.7569444444444445 | 137.347 |
| 0.7576388888888889 | 137.347 |
| 0.7583333333333333 | 137.347 |
| 0.7590277777777777 | 137.347 |
| 0.7597222222222223 | 132.814 |
| 0.7604166666666666 | 132.814 |
| 0.7611111111111111 | 128.284 |
| 0.7618055555555556 | 128.284 |
| 0.7625000000000001 | 128.284 |
| 0.7631944444444444 | 128.284 |
| 0.7638888888888888 | 123.758 |
| 0.7645833333333334 | 123.758 |
| 0.7652777777777778 | 123.758 |
| 0.7659722222222222 | 119.235 |
| 0.7666666666666666 | 119.235 |
| 0.7673611111111112 | 119.235 |
| 0.7680555555555556 | 119.235 |
| 0.7687499999999999 | 119.235 |
| 0.7694444444444444 | 114.716 |
| 0.7701388888888889 | 114.716 |
| 0.7708333333333334 | 114.716 |
| 0.7715277777777777 | 114.716 |
| 0.7722222222222223 | 110.201 |
| 0.7729166666666667 | 110.201 |
| 0.7736111111111111 | 110.201 |
| 0.7743055555555555 | 110.201 |
| 0.775 | 110.201 |
| 0.7756944444444445 | 110.201 |
| 0.7763888888888889 | 105.69 |
| 0.7770833333333332 | 105.69 |
| 0.7777777777777778 | 105.69 |
| 0.7784722222222222 | 105.69 |
| 0.7791666666666667 | 101.184 |
| 0.779861111111111 | 101.184 |
| 0.7805555555555556 | 101.184 |
| 0.78125 | 101.184 |
| 0.7819444444444444 | 101.184 |
| 0.782638888888889 | 101.184 |
| 0.7833333333333333 | 101.184 |
| 0.7840277777777778 | 96.682 |
| 0.7847222222222222 | 96.682 |
| 0.7854166666666668 | 96.682 |
| 0.7861111111111111 | 92.184 |
| 0.7868055555555555 | 92.184 |
| 0.7875 | 92.184 |
| 0.7881944444444445 | 92.184 |
| 0.7888888888888889 | 92.184 |
| 0.7895833333333333 | 92.184 |
| 0.7902777777777777 | 87.692 |
| 0.7909722222222223 | 87.692 |
| 0.7916666666666666 | 87.692 |
| 0.7923611111111111 | 87.692 |
| 0.7930555555555556 | 83.205 |
| 0.7937500000000001 | 83.205 |
| 0.7944444444444444 | 83.205 |
| 0.7951388888888888 | 83.205 |
| 0.7958333333333334 | 83.205 |
| 0.7965277777777778 | 83.205 |
| 0.7972222222222222 | 83.205 |
| 0.7979166666666666 | 83.205 |
| 0.7986111111111112 | 83.205 |
| 0.7993055555555556 | 83.205 |
| 0.7999999999999999 | 83.205 |
| 0.8006944444444444 | 83.205 |
| 0.8013888888888889 | 83.205 |
| 0.8020833333333334 | 83.205 |
| 0.8027777777777777 | 83.205 |
| 0.8034722222222223 | 83.205 |
| 0.8041666666666667 | 83.205 |
| 0.8048611111111111 | 83.205 |
| 0.8055555555555555 | 83.205 |
| 0.80625 | 83.205 |
| 0.8069444444444445 | 87.692 |
| 0.8076388888888889 | 87.692 |
| 0.8083333333333332 | 92.184 |
| 0.8090277777777778 | 96.682 |
| 0.8097222222222222 | 96.682 |
| 0.8104166666666667 | 101.184 |
| 0.811111111111111 | 101.184 |
| 0.8118055555555556 | 101.184 |
| 0.8125 | 101.184 |
| 0.8131944444444444 | 96.682 |
| 0.813888888888889 | 96.682 |
| 0.8145833333333333 | 92.184 |
| 0.8152777777777778 | 87.692 |
| 0.8159722222222222 | 83.205 |
| 0.8166666666666668 | 83.205 |
| 0.8173611111111111 | 78.722 |
| 0.8180555555555555 | 74.246 |
| 0.81875 | 69.775 |
| 0.8194444444444445 | 65.31 |
| 0.8201388888888889 | 65.31 |
| 0.8208333333333333 | 60.85 |
| 0.8215277777777777 | 56.398 |
| 0.8222222222222223 | 56.398 |
| 0.8229166666666666 | 51.951 |
| 0.8236111111111111 | 47.511 |
| 0.8243055555555556 | 43.079 |
| 0.8250000000000001 | 43.079 |
| 0.8256944444444444 | 38.653 |
| 0.8263888888888888 | 38.653 |
| 0.8270833333333334 | 34.234 |
| 0.8277777777777778 | 34.234 |
| 0.8284722222222222 | 29.823 |
| 0.8291666666666666 | 29.823 |
| 0.8298611111111112 | 29.823 |
| 0.8305555555555556 | 25.419 |
| 0.8312499999999999 | 25.419 |
| 0.8319444444444444 | 25.419 |
| 0.8326388888888889 | 25.419 |
| 0.8333333333333334 | 21.024 |
| 0.8340277777777777 | 21.024 |
| 0.8347222222222223 | 21.024 |
| 0.8354166666666667 | 16.636 |
| 0.8361111111111111 | 16.636 |
| 0.8368055555555555 | 16.636 |
| 0.8375 | 12.257 |
| 0.8381944444444445 | 12.257 |
| 0.8388888888888889 | 12.257 |
| 0.8395833333333332 | 12.257 |
| 0.8402777777777778 | 12.257 |
| 0.8409722222222222 | 12.257 |
| 0.8416666666666667 | 7.887 |
| 0.842361111111111 | 7.887 |
| 0.8430555555555556 | 7.887 |
| 0.84375 | 7.887 |
| 0.8444444444444444 | 7.887 |
| 0.845138888888889 | 7.887 |
| 0.8458333333333333 | 7.887 |
| 0.8465277777777778 | 3.525 |
| 0.8472222222222222 | 3.525 |
| 0.8479166666666668 | 3.525 |
| 0.8486111111111111 | 3.525 |
| 0.8493055555555555 | 3.525 |
| 0.85 | 3.525 |
| 0.8506944444444445 | 0 |
| 0.8513888888888889 | 0 |
| 0.8520833333333333 | 0 |
| 0.8527777777777777 | 0 |
| 0.8534722222222223 | 0 |
| 0.8541666666666666 | 0 |
| 0.8548611111111111 | 0 |
| 0.8555555555555556 | 0 |
| 0.8562500000000001 | 0 |
| 0.8569444444444444 | 0 |
| 0.8576388888888888 | 0 |
| 0.8583333333333334 | 0 |
| 0.8590277777777778 | 0 |
| 0.8597222222222222 | 0 |
| 0.8604166666666666 | 0 |
| 0.8611111111111112 | 0 |
| 0.8618055555555556 | 0 |
| 0.8624999999999999 | 0 |
| 0.8631944444444444 | 0 |
| 0.8638888888888889 | 0 |
| 0.8645833333333334 | 0 |
| 0.8652777777777777 | 0 |
| 0.8659722222222223 | 0 |
| 0.8666666666666667 | 0 |
| 0.8673611111111111 | 0 |
| 0.8680555555555555 | 0 |
| 0.86875 | 0 |
| 0.8694444444444445 | 0 |
| 0.8701388888888889 | 0 |
| 0.8708333333333332 | 0 |
| 0.8715277777777778 | 0 |
| 0.8722222222222222 | 0 |
| 0.8729166666666667 | 0 |
| 0.873611111111111 | 0 |
| 0.8743055555555556 | 0 |
| 0.875 | 0 |
| 0.8756944444444444 | 0 |
| 0.876388888888889 | 0 |
| 0.8770833333333333 | 0 |
| 0.8777777777777778 | 0 |
| 0.8784722222222222 | 0 |
| 0.8791666666666668 | 0 |
| 0.8798611111111111 | 0 |
| 0.8805555555555555 | 0 |
| 0.88125 | 0 |
| 0.8819444444444445 | 0 |
| 0.8826388888888889 | 0 |
| 0.8833333333333333 | 0 |
| 0.8840277777777777 | 0 |
| 0.8847222222222223 | 0 |
| 0.8854166666666666 | 0 |
| 0.8861111111111111 | 0 |
| 0.8868055555555556 | 0 |
| 0.8875000000000001 | 0 |
| 0.8881944444444444 | 0 |
| 0.8888888888888888 | 0 |
| 0.8895833333333334 | 0 |
| 0.8902777777777778 | 0 |
| 0.8909722222222222 | 0 |
| 0.8916666666666666 | 0 |
| 0.8923611111111112 | 0 |
| 0.8930555555555556 | 0 |
| 0.8937499999999999 | 0 |
| 0.8944444444444444 | 0 |
| 0.8951388888888889 | 0 |
| 0.8958333333333334 | 0 |
| 0.8965277777777777 | 0 |
| 0.8972222222222223 | 0 |
| 0.8979166666666667 | 0 |
| 0.8986111111111111 | 0 |
| 0.8993055555555555 | 0 |
| 0.9 | 0 |
| 0.9006944444444445 | 0 |
| 0.9013888888888889 | 0 |
| 0.9020833333333332 | 0 |
| 0.9027777777777778 | 0 |
| 0.9034722222222222 | 0 |
| 0.9041666666666667 | 0 |
| 0.904861111111111 | 0 |
| 0.9055555555555556 | 0 |
| 0.90625 | 0 |
| 0.9069444444444444 | 0 |
| 0.907638888888889 | 0 |
| 0.9083333333333333 | 0 |
| 0.9090277777777778 | 0 |
| 0.9097222222222222 | 0 |
| 0.9104166666666668 | 0 |
| 0.9111111111111111 | 0 |
| 0.9118055555555555 | 0 |
| 0.9125 | 0 |
| 0.9131944444444445 | 0 |
| 0.9138888888888889 | 0 |
| 0.9145833333333333 | 0 |
| 0.9152777777777777 | 0 |
| 0.9159722222222223 | 0 |
| 0.9166666666666666 | 0 |
| 0.9173611111111111 | 0 |
| 0.9180555555555556 | 0 |
| 0.9187500000000001 | 0 |
| 0.9194444444444444 | 0 |
| 0.9201388888888888 | 0 |
| 0.9208333333333334 | 0 |
| 0.9215277777777778 | 0 |
| 0.9222222222222222 | 0 |
| 0.9229166666666666 | 0 |
| 0.9236111111111112 | 0 |
| 0.9243055555555556 | 0 |
| 0.9249999999999999 | 0 |
| 0.9256944444444444 | 0 |
| 0.9263888888888889 | 0 |
| 0.9270833333333334 | 0 |
| 0.9277777777777777 | 0 |
| 0.9284722222222223 | 0 |
| 0.9291666666666667 | 0 |
| 0.9298611111111111 | 0 |
| 0.9305555555555555 | 0 |
| 0.93125 | 0 |
| 0.9319444444444445 | 0 |
| 0.9326388888888889 | 0 |
| 0.9333333333333332 | 0 |
| 0.9340277777777778 | 0 |
| 0.9347222222222222 | 0 |
| 0.9354166666666667 | 0 |
| 0.936111111111111 | 0 |
| 0.9368055555555556 | 0 |
| 0.9375 | 0 |
| 0.9381944444444444 | 0 |
| 0.938888888888889 | 0 |
| 0.9395833333333333 | 0 |
| 0.9402777777777778 | 0 |
| 0.9409722222222222 | 0 |
| 0.9416666666666668 | 0 |
| 0.9423611111111111 | 0 |
| 0.9430555555555555 | 0 |
| 0.94375 | 0 |
| 0.9444444444444445 | 0 |
| 0.9451388888888889 | 0 |
| 0.9458333333333333 | 0 |
| 0.9465277777777777 | 0 |
| 0.9472222222222223 | 0 |
| 0.9479166666666666 | 0 |
| 0.9486111111111111 | 0 |
| 0.9493055555555556 | 0 |
| 0.9500000000000001 | 0 |
| 0.9506944444444444 | 0 |
| 0.9513888888888888 | 0 |
| 0.9520833333333334 | 0 |
| 0.9527777777777778 | 0 |
| 0.9534722222222222 | 0 |
| 0.9541666666666666 | 0 |
| 0.9548611111111112 | 0 |
| 0.9555555555555556 | 0 |
| 0.9562499999999999 | 0 |
| 0.9569444444444444 | 0 |
| 0.9576388888888889 | 0 |
| 0.9583333333333334 | 0 |
| 0.9590277777777777 | 0 |
| 0.9597222222222223 | 0 |
| 0.9604166666666667 | 0 |
| 0.9611111111111111 | 0 |
| 0.9618055555555555 | 0 |
| 0.9625 | 0 |
| 0.9631944444444445 | 0 |
| 0.9638888888888889 | 0 |
| 0.9645833333333332 | 0 |
| 0.9652777777777778 | 0 |
| 0.9659722222222222 | 0 |
| 0.9666666666666667 | 0 |
| 0.967361111111111 | 0 |
| 0.9680555555555556 | 0 |
| 0.96875 | 0 |
| 0.9694444444444444 | 0 |
| 0.970138888888889 | 0 |
| 0.9708333333333333 | 0 |
| 0.9715277777777778 | 0 |
| 0.9722222222222222 | 0 |
| 0.9729166666666668 | 0 |
| 0.9736111111111111 | 0 |
| 0.9743055555555555 | 0 |
| 0.975 | 0 |
| 0.9756944444444445 | 0 |
| 0.9763888888888889 | 0 |
| 0.9770833333333333 | 0 |
| 0.9777777777777777 | 0 |
| 0.9784722222222223 | 0 |
| 0.9791666666666666 | 0 |
| 0.9798611111111111 | 0 |
| 0.9805555555555556 | 0 |
| 0.9812500000000001 | 0 |
| 0.9819444444444444 | 0 |
| 0.9826388888888888 | 0 |
| 0.9833333333333334 | 0 |
| 0.9840277777777778 | 0 |
| 0.9847222222222222 | 0 |
| 0.9854166666666666 | 0 |
| 0.9861111111111112 | 0 |
| 0.9868055555555556 | 0 |
| 0.9874999999999999 | 0 |
| 0.9881944444444444 | 0 |
| 0.9888888888888889 | 0 |
| 0.9895833333333334 | 0 |
| 0.9902777777777777 | 0 |
| 0.9909722222222223 | 0 |
| 0.9916666666666667 | 0 |
| 0.9923611111111111 | 0 |
| 0.9930555555555555 | 0 |
| 0.99375 | 0 |
| 0.9944444444444445 | 0 |
| 0.9951388888888889 | 0 |
| 0.9958333333333332 | 0 |
| 0.9965277777777778 | 0 |
| 0.9972222222222222 | 0 |
| 0.9979166666666667 | 0 |
| 0.998611111111111 | 0 |
| 0.9993055555555556 | 0 |